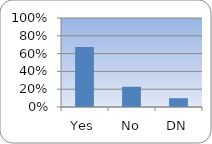
| Category | Series 0 |
|---|---|
| Yes | 0.674 |
| No | 0.227 |
| DN | 0.099 |